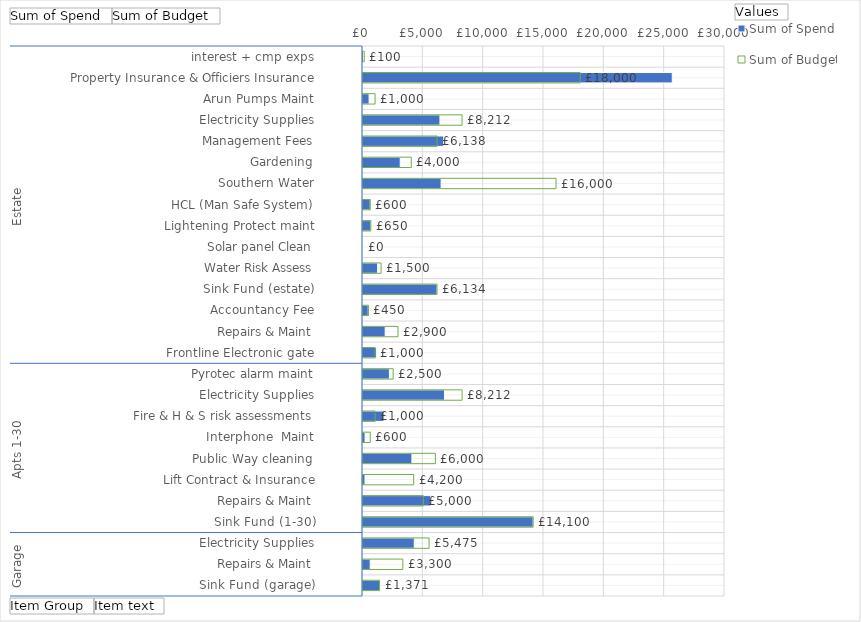
| Category | Sum of Spend | Sum of Budget |
|---|---|---|
| 0 | 0 | 100 |
| 1 | 25628.86 | 18000 |
| 2 | 503.8 | 1000 |
| 3 | 6376.68 | 8212 |
| 4 | 6690.76 | 6138 |
| 5 | 3085 | 4000 |
| 6 | 6474 | 16000 |
| 7 | 601.2 | 600 |
| 8 | 648 | 650 |
| 9 | 0 | 0 |
| 10 | 1210.92 | 1500 |
| 11 | 6134 | 6134 |
| 12 | 432 | 450 |
| 13 | 1838.15 | 2900 |
| 14 | 1129.69 | 1000 |
| 15 | 2188.2 | 2500 |
| 16 | 6756.68 | 8212 |
| 17 | 1740 | 1000 |
| 18 | 171 | 600 |
| 19 | 4053.5 | 6000 |
| 20 | 166.59 | 4200 |
| 21 | 5615.49 | 5000 |
| 22 | 14100 | 14100 |
| 23 | 4249.48 | 5475 |
| 24 | 596.2 | 3300 |
| 25 | 1371 | 1371 |